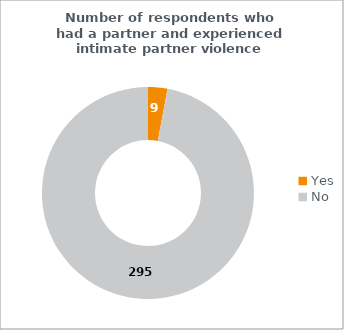
| Category | Series 1 |
|---|---|
| Yes | 9 |
| No | 295 |